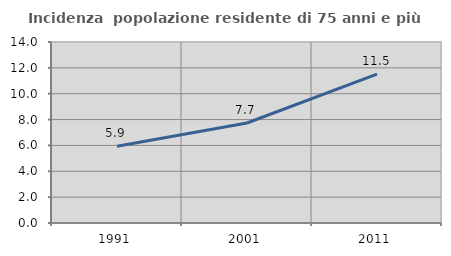
| Category | Incidenza  popolazione residente di 75 anni e più |
|---|---|
| 1991.0 | 5.936 |
| 2001.0 | 7.735 |
| 2011.0 | 11.515 |